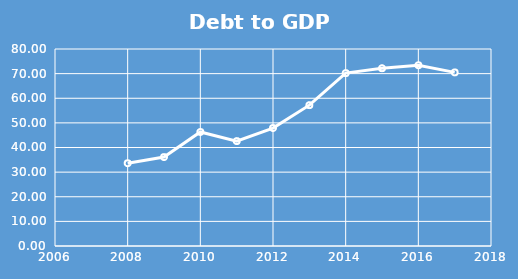
| Category | Debtto GDP Ratio |
|---|---|
| 2008.0 | 33.6 |
| 2009.0 | 36.1 |
| 2010.0 | 46.3 |
| 2011.0 | 42.6 |
| 2012.0 | 47.9 |
| 2013.0 | 57.2 |
| 2014.0 | 70.2 |
| 2015.0 | 72.2 |
| 2016.0 | 73.4 |
| 2017.0 | 70.5 |